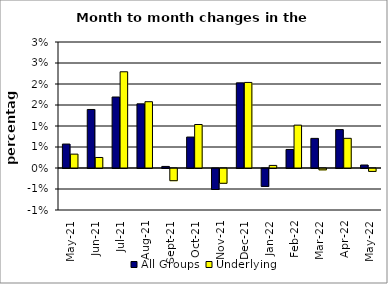
| Category | All Groups | Underlying |
|---|---|---|
| 2021-05-01 | 0.006 | 0.003 |
| 2021-06-01 | 0.014 | 0.003 |
| 2021-07-01 | 0.017 | 0.023 |
| 2021-08-01 | 0.015 | 0.016 |
| 2021-09-01 | 0 | -0.003 |
| 2021-10-01 | 0.007 | 0.01 |
| 2021-11-01 | -0.005 | -0.004 |
| 2021-12-01 | 0.02 | 0.02 |
| 2022-01-01 | -0.004 | 0.001 |
| 2022-02-01 | 0.004 | 0.01 |
| 2022-03-01 | 0.007 | 0 |
| 2022-04-01 | 0.009 | 0.007 |
| 2022-05-01 | 0.001 | -0.001 |